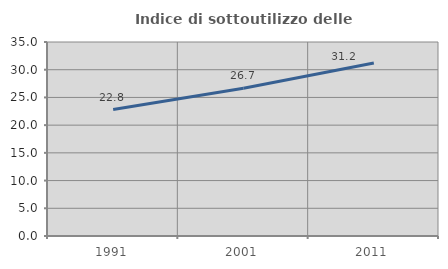
| Category | Indice di sottoutilizzo delle abitazioni  |
|---|---|
| 1991.0 | 22.815 |
| 2001.0 | 26.653 |
| 2011.0 | 31.201 |